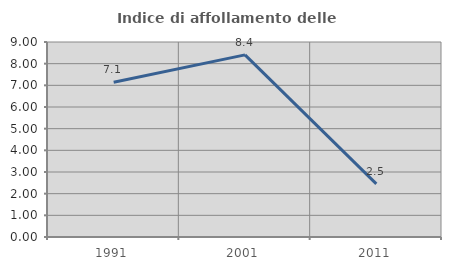
| Category | Indice di affollamento delle abitazioni  |
|---|---|
| 1991.0 | 7.143 |
| 2001.0 | 8.406 |
| 2011.0 | 2.452 |